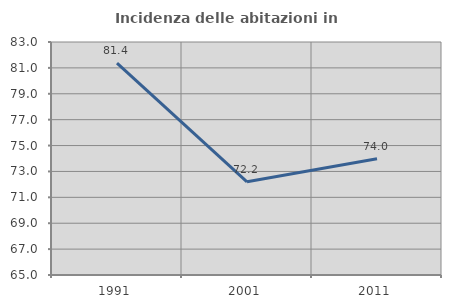
| Category | Incidenza delle abitazioni in proprietà  |
|---|---|
| 1991.0 | 81.37 |
| 2001.0 | 72.199 |
| 2011.0 | 73.985 |